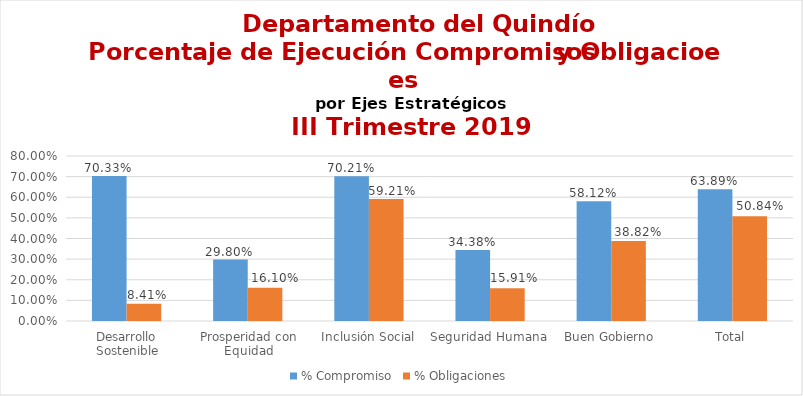
| Category | % Compromiso | % Obligaciones |
|---|---|---|
| Desarrollo Sostenible | 0.703 | 0.084 |
| Prosperidad con Equidad | 0.298 | 0.161 |
| Inclusión Social | 0.702 | 0.592 |
| Seguridad Humana | 0.344 | 0.159 |
| Buen Gobierno | 0.581 | 0.388 |
| Total | 0.639 | 0.508 |